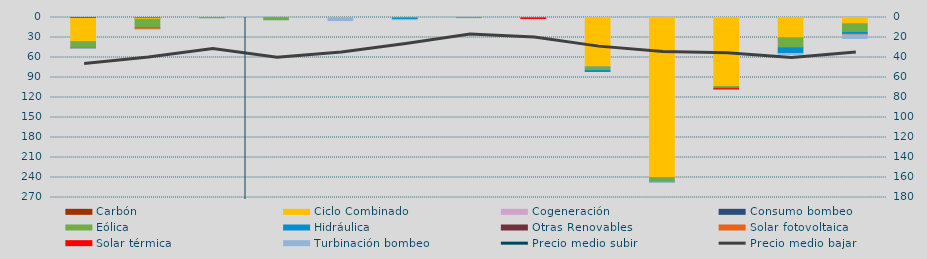
| Category | Carbón | Ciclo Combinado | Cogeneración | Consumo bombeo | Eólica | Hidráulica | Otras Renovables | Solar fotovoltaica | Solar térmica | Turbinación bombeo |
|---|---|---|---|---|---|---|---|---|---|---|
| 0 | 1161 | 34847 | 340.9 |  | 9473.4 | 120 | 0 | 21.4 | 39.8 | 400 |
| 1 | 846 | 1898.8 | 0 |  | 12932.4 | 1173 | 80 | 33 | 0 | 0 |
| 2 | 0 | 0 | 0 |  | 464.6 | 0 | 0 | 0 | 0 | 0 |
| 3 | 0 | 0 | 0 |  | 3444.7 | 0 | 0 | 0 | 0 | 0 |
| 4 | 0 | 0 | 0 |  | 0 | 0 | 0 | 0 | 0 | 4657.9 |
| 5 | 0 | 0 | 0 |  | 1293.6 | 1910.2 | 0 | 0 | 0 | 100 |
| 6 | 0 | 0 | 0 |  | 227.5 | 0 | 0 | 0 | 0 | 0 |
| 7 | 0 | 0 | 0 |  | 0 | 946.5 | 0 | 61.6 | 516 | 0 |
| 8 | 0 | 73835.8 | 271.4 |  | 5567.4 | 2850.8 | 0 | 0 | 0 | 0 |
| 9 | 0 | 239981.7 | 135.5 |  | 5593.5 | 740.7 | 0 | 320.4 | 0 | 640 |
| 10 | 0 | 103567.5 | 0 |  | 2385.4 | 710 | 0 | 170.6 | 366.5 | 0 |
| 11 | 0 | 30277.5 | 252.2 |  | 15007.3 | 8686.8 | 0 | 0 | 0 | 1087 |
| 12 | 0 | 9485.3 | 0 |  | 12915.2 | 2939 | 429 | 195.7 | 0 | 5519 |